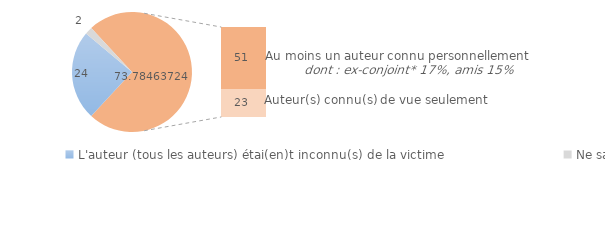
| Category | Series 0 |
|---|---|
| L'auteur (tous les auteurs) étai(en)t inconnu(s) de la victime | 24.211 |
| Ne sait pas/Refus | 2 |
| L'auteur (au moins un auteur) était connu de vue ou personnellement  | 50.765 |